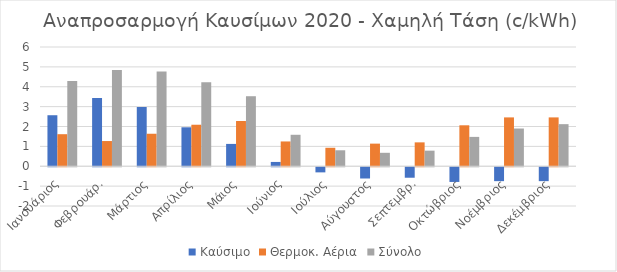
| Category | Καύσιμο | Θερμοκ. Αέρια | Σύνολο |
|---|---|---|---|
| Ιανουάριος | 2.567 | 1.613 | 4.292 |
| Φεβρουάρ. | 3.433 | 1.269 | 4.844 |
| Μάρτιος | 2.981 | 1.635 | 4.766 |
| Απρίλιος | 1.96 | 2.089 | 4.23 |
| Μάιος | 1.124 | 2.275 | 3.523 |
| Ιούνιος | 0.217 | 1.248 | 1.583 |
| Ιούλιος | -0.258 | 0.93 | 0.804 |
| Αύγουστος | -0.566 | 1.138 | 0.676 |
| Σεπτεμβρ. | -0.527 | 1.202 | 0.785 |
| Οκτώβριος | -0.74 | 2.061 | 1.477 |
| Νοέμβριος | -0.699 | 2.458 | 1.898 |
| Δεκέμβριος | -0.699 | 2.458 | 2.118 |